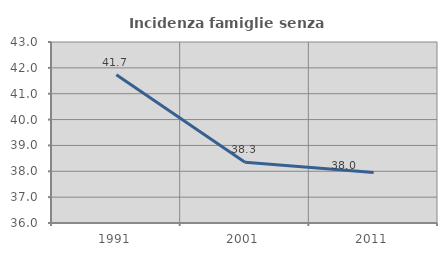
| Category | Incidenza famiglie senza nuclei |
|---|---|
| 1991.0 | 41.732 |
| 2001.0 | 38.346 |
| 2011.0 | 37.956 |